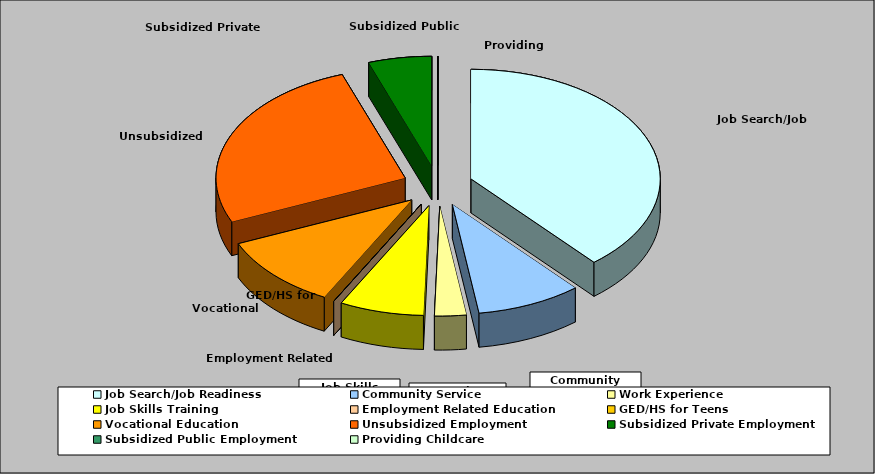
| Category | Series 0 |
|---|---|
| Job Search/Job Readiness | 0.387 |
| Community Service | 0.09 |
| Work Experience | 0.027 |
| Job Skills Training | 0.072 |
| Employment Related Education | 0 |
| GED/HS for Teens | 0 |
| Vocational Education | 0.108 |
| Unsubsidized Employment | 0.261 |
| Subsidized Private Employment | 0.054 |
| Subsidized Public Employment | 0 |
| Providing Childcare | 0 |